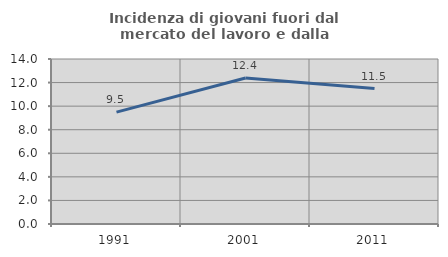
| Category | Incidenza di giovani fuori dal mercato del lavoro e dalla formazione  |
|---|---|
| 1991.0 | 9.492 |
| 2001.0 | 12.389 |
| 2011.0 | 11.494 |